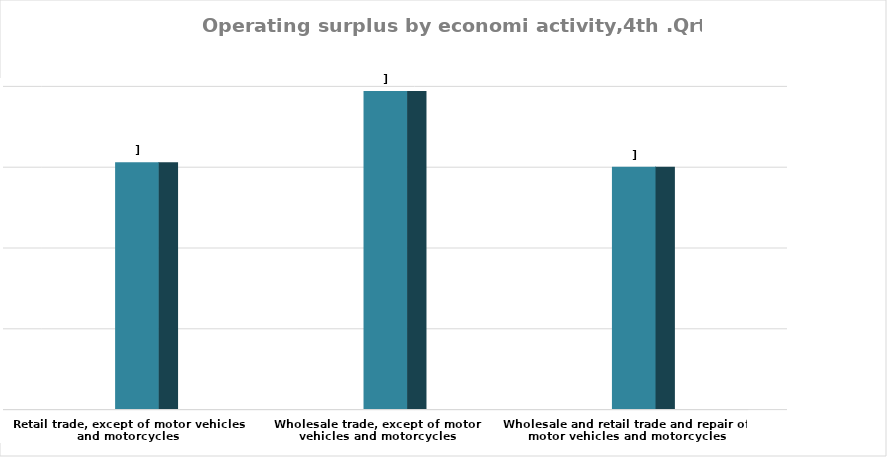
| Category | Series 0 |
|---|---|
| Wholesale and retail trade and repair of motor vehicles and motorcycles | 14998513216.653 |
| Wholesale trade, except of motor vehicles and motorcycles | 19674680835.99 |
| Retail trade, except of motor vehicles and motorcycles | 15276202189.576 |